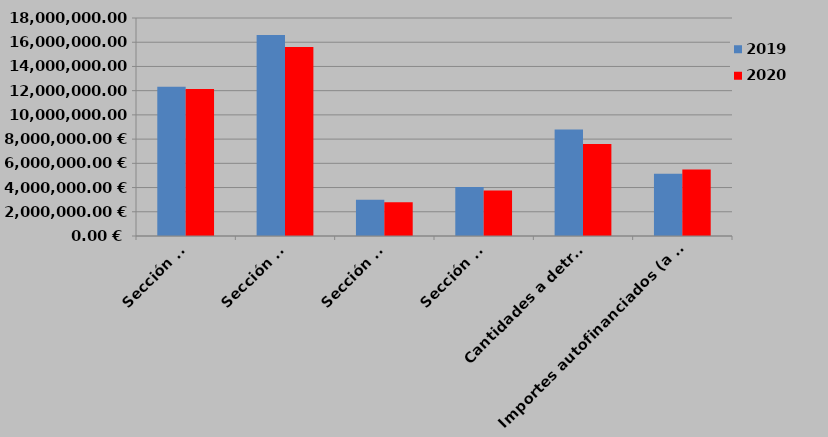
| Category | 2019 | 2020 |
|---|---|---|
| Sección 1ª | 12316577 | 12141254 |
| Sección 2ª | 16600000 | 15600000 |
| Sección 3ª | 3002059 | 2788486.55 |
| Sección 4ª | 4037275 | 3753515.79 |
| Cantidades a detraer | 8799510 | 7589863.2 |
| Importes autofinanciados (a deducir) | 5134399 | 5482300 |